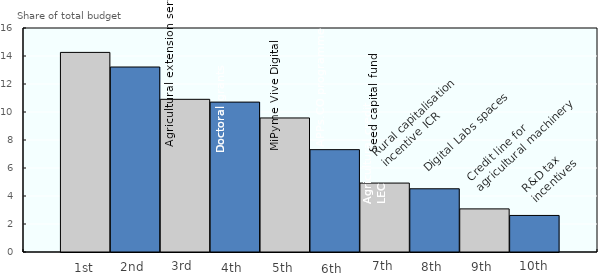
| Category | 1st | 2nd | 3rd | 4th | 5th | 6th | 7th | 8th | 9th | 10th |
|---|---|---|---|---|---|---|---|---|---|---|
| 0 | 14.258 | 13.213 | 10.906 | 10.707 | 9.574 | 7.311 | 4.923 | 4.517 | 3.08 | 2.611 |